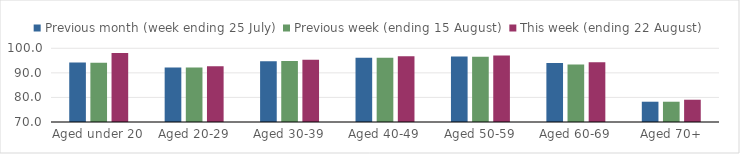
| Category | Previous month (week ending 25 July) | Previous week (ending 15 August) | This week (ending 22 August) |
|---|---|---|---|
| Aged under 20 | 94.255 | 94.137 | 98.089 |
| Aged 20-29 | 92.151 | 92.146 | 92.74 |
| Aged 30-39 | 94.711 | 94.776 | 95.334 |
| Aged 40-49 | 96.141 | 96.184 | 96.764 |
| Aged 50-59 | 96.642 | 96.529 | 97.111 |
| Aged 60-69 | 93.989 | 93.36 | 94.344 |
| Aged 70+ | 78.256 | 78.25 | 79.064 |